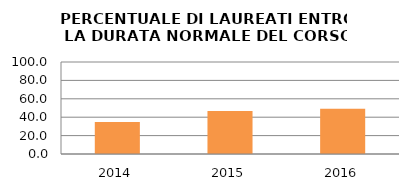
| Category | 2014 2015 2016 |
|---|---|
| 2014.0 | 34.783 |
| 2015.0 | 46.809 |
| 2016.0 | 49.057 |